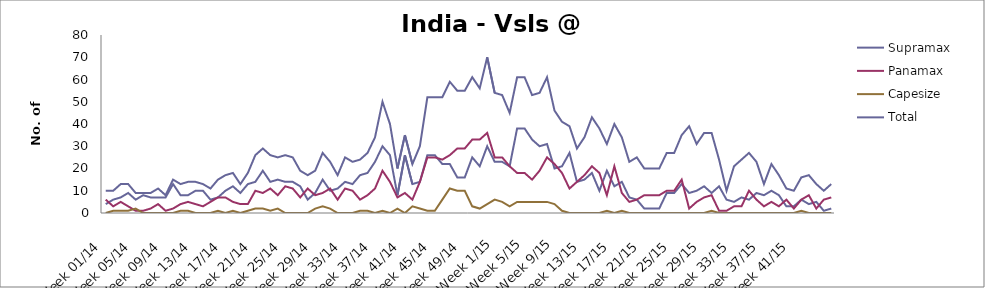
| Category | Supramax | Panamax | Capesize | Total |
|---|---|---|---|---|
| Week 01/14 | 4 | 6 | 0 | 10 |
| Week 02/14 | 6 | 3 | 1 | 10 |
| Week 03/14 | 7 | 5 | 1 | 13 |
| Week 04/14 | 9 | 3 | 1 | 13 |
| Week 05/14 | 6 | 1 | 2 | 9 |
| Week 06/14 | 8 | 1 | 0 | 9 |
| Week 07/14 | 7 | 2 | 0 | 9 |
| Week 08/14 | 7 | 4 | 0 | 11 |
| Week 09/14 | 7 | 1 | 0 | 8 |
| Week 10/14 | 13 | 2 | 0 | 15 |
| Week 11/14 | 8 | 4 | 1 | 13 |
| Week 12/14 | 8 | 5 | 1 | 14 |
| Week 13/14 | 10 | 4 | 0 | 14 |
| Week 14/14 | 10 | 3 | 0 | 13 |
| Week 15/14 | 6 | 5 | 0 | 11 |
| Week 16/14 | 7 | 7 | 1 | 15 |
| Week 17/14 | 10 | 7 | 0 | 17 |
| Week 18/14 | 12 | 5 | 1 | 18 |
| Week 19/14 | 9 | 4 | 0 | 13 |
| Week 20/14 | 13 | 4 | 1 | 18 |
| Week 21/14 | 14 | 10 | 2 | 26 |
| Week 22/14 | 19 | 9 | 2 | 29 |
| Week 23/14 | 14 | 11 | 1 | 26 |
| Week 24/14 | 15 | 8 | 2 | 25 |
| Week 25/14 | 14 | 12 | 0 | 26 |
| Week 26/14 | 14 | 11 | 0 | 25 |
| Week 27/14 | 12 | 7 | 0 | 19 |
| Week 28/14 | 6 | 11 | 0 | 17 |
| Week 29/14 | 9 | 8 | 2 | 19 |
| Week 30/14 | 15 | 9 | 3 | 27 |
| Week 31/14 | 10 | 11 | 2 | 23 |
| Week 32/14 | 11 | 6 | 0 | 17 |
| Week 33/14 | 14 | 11 | 0 | 25 |
| Week 34/14 | 13 | 10 | 0 | 23 |
| Week 35/14 | 17 | 6 | 1 | 24 |
| Week 36/14 | 18 | 8 | 1 | 27 |
| Week 37/14 | 23 | 11 | 0 | 34 |
| Week 38/14 | 30 | 19 | 1 | 50 |
| Week 39/14 | 26 | 14 | 0 | 40 |
| Week 40/14 | 8 | 7 | 2 | 20 |
| Week 41/14 | 26 | 9 | 0 | 35 |
| Week 42/14 | 13 | 6 | 3 | 22 |
| Week 43/14 | 14 | 14 | 2 | 30 |
| Week 44/14 | 26 | 25 | 1 | 52 |
| Week 45/14 | 26 | 25 | 1 | 52 |
| Week 46/14 | 22 | 24 | 6 | 52 |
| Week 47/14 | 22 | 26 | 11 | 59 |
| Week 48/14 | 16 | 29 | 10 | 55 |
| Week 49/14 | 16 | 29 | 10 | 55 |
| Week 50/14 | 25 | 33 | 3 | 61 |
| Week 51/14 | 21 | 33 | 2 | 56 |
| Week 52/14 | 30 | 36 | 4 | 70 |
| Week 1/15 | 23 | 25 | 6 | 54 |
| Week 2/15 | 23 | 25 | 5 | 53 |
| Week 3/15 | 21 | 21 | 3 | 45 |
| Week 4/15 | 38 | 18 | 5 | 61 |
| Week 5/15 | 38 | 18 | 5 | 61 |
| Week 6/15 | 33 | 15 | 5 | 53 |
| Week 7/15 | 30 | 19 | 5 | 54 |
| Week 8/15 | 31 | 25 | 5 | 61 |
| Week 9/15 | 20 | 22 | 4 | 46 |
| Week 10/15 | 21 | 18 | 1 | 41 |
| Week 11/15 | 27 | 11 | 0 | 39 |
| Week 12/15 | 14 | 14 | 0 | 29 |
| Week 13/15 | 15 | 17 | 0 | 34 |
| Week 14/15 | 18 | 21 | 0 | 43 |
| Week 15/15 | 10 | 18 | 0 | 38 |
| Week 16/15 | 19 | 8 | 1 | 31 |
| Week 17/15 | 12 | 21 | 0 | 40 |
| Week 18/15 | 14 | 9 | 1 | 34 |
| Week 19/15 | 7 | 5 | 0 | 23 |
| Week 20/15 | 6 | 6 | 0 | 25 |
| Week 21/15 | 2 | 8 | 0 | 20 |
| Week 22/15 | 2 | 8 | 0 | 20 |
| Week 23/15 | 2 | 8 | 0 | 20 |
| Week 24/15 | 9 | 10 | 0 | 27 |
| Week 25/15 | 9 | 10 | 0 | 27 |
| Week 26/15 | 13 | 15 | 0 | 35 |
| Week 27/15 | 9 | 2 | 0 | 39 |
| Week 28/15 | 10 | 5 | 0 | 31 |
| Week 29/15 | 12 | 7 | 0 | 36 |
| Week 30/15 | 9 | 8 | 1 | 36 |
| Week 31/15 | 12 | 1 | 0 | 24 |
| Week 32/15 | 6 | 1 | 0 | 10 |
| Week 33/15 | 5 | 3 | 0 | 21 |
| Week 34/15 | 7 | 3 | 0 | 24 |
| Week 35/15 | 6 | 10 | 0 | 27 |
| Week 36/15 | 9 | 6 | 0 | 23 |
| Week 37/15 | 8 | 3 | 0 | 13 |
| Week 38/15 | 10 | 5 | 0 | 22 |
| Week 39/15 | 8 | 3 | 0 | 17 |
| Week 40/15 | 3 | 6 | 0 | 11 |
| Week 41/15 | 3 | 2 | 0 | 10 |
| Week 42/15 | 6 | 6 | 1 | 16 |